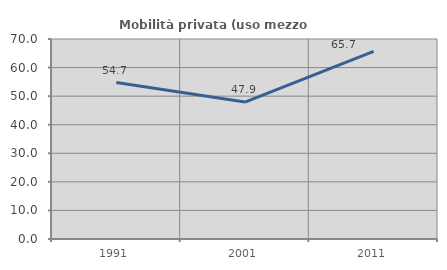
| Category | Mobilità privata (uso mezzo privato) |
|---|---|
| 1991.0 | 54.747 |
| 2001.0 | 47.929 |
| 2011.0 | 65.664 |